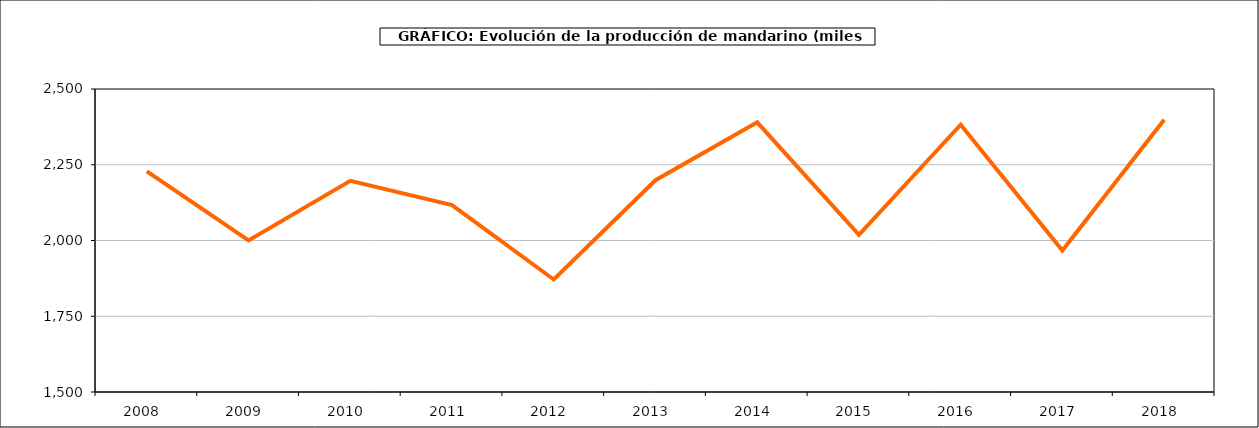
| Category | producción |
|---|---|
| 2008.0 | 2227.916 |
| 2009.0 | 2000.149 |
| 2010.0 | 2196.89 |
| 2011.0 | 2117.119 |
| 2012.0 | 1871.265 |
| 2013.0 | 2198.926 |
| 2014.0 | 2389.894 |
| 2015.0 | 2018.755 |
| 2016.0 | 2382.073 |
| 2017.0 | 1967.018 |
| 2018.0 | 2398.621 |